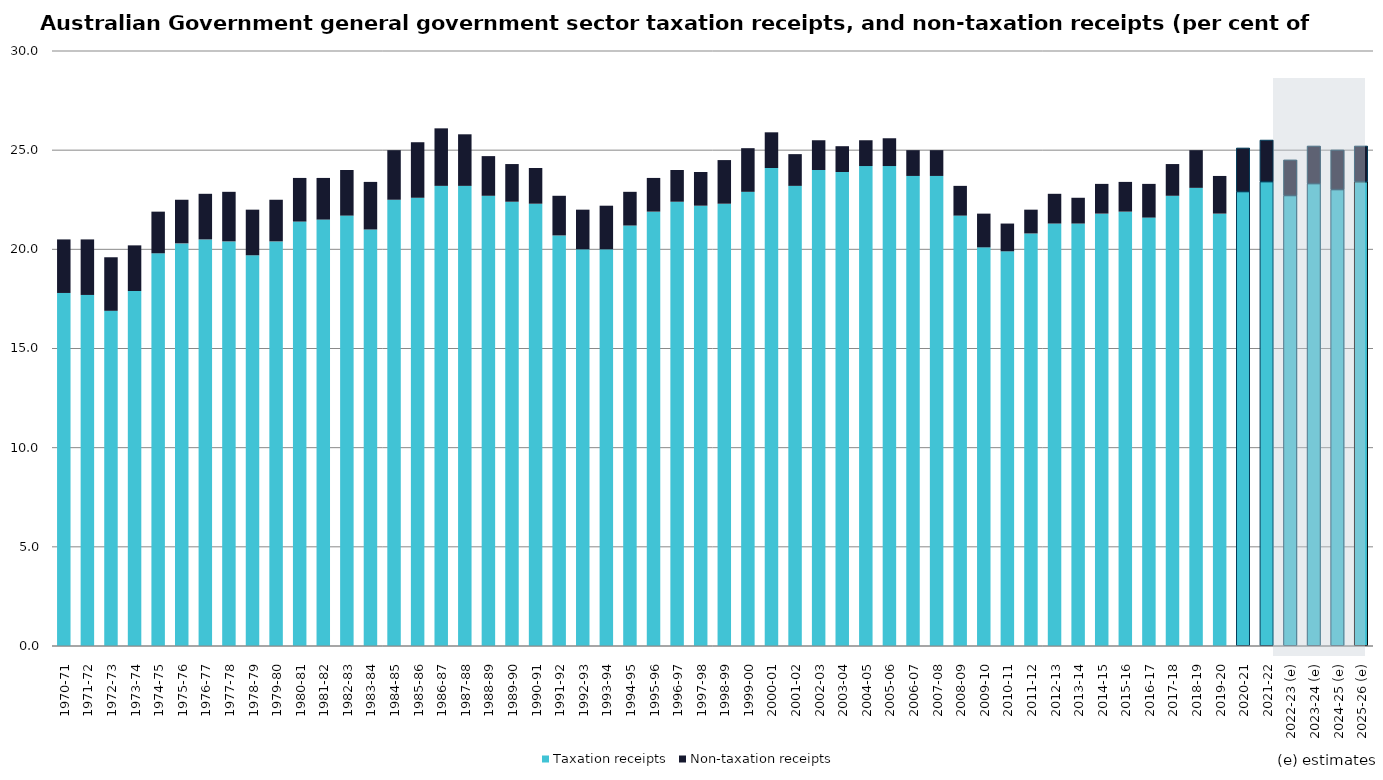
| Category | Taxation receipts | Non-taxation receipts |
|---|---|---|
| 1970-71 | 17.8 | 2.7 |
| 1971-72 | 17.7 | 2.8 |
| 1972-73 | 16.9 | 2.7 |
| 1973-74 | 17.9 | 2.3 |
| 1974-75 | 19.8 | 2.1 |
| 1975-76 | 20.3 | 2.2 |
| 1976-77 | 20.5 | 2.3 |
| 1977-78 | 20.4 | 2.5 |
| 1978-79 | 19.7 | 2.3 |
| 1979-80 | 20.4 | 2.1 |
| 1980-81 | 21.4 | 2.2 |
| 1981-82 | 21.5 | 2.1 |
| 1982-83 | 21.7 | 2.3 |
| 1983-84 | 21 | 2.4 |
| 1984-85 | 22.5 | 2.5 |
| 1985-86 | 22.6 | 2.8 |
| 1986-87 | 23.2 | 2.9 |
| 1987-88 | 23.2 | 2.6 |
| 1988-89 | 22.7 | 2 |
| 1989-90 | 22.4 | 1.9 |
| 1990-91 | 22.3 | 1.8 |
| 1991-92 | 20.7 | 2 |
| 1992-93 | 20 | 2 |
| 1993-94 | 20 | 2.2 |
| 1994-95 | 21.2 | 1.7 |
| 1995-96 | 21.9 | 1.7 |
| 1996-97 | 22.4 | 1.6 |
| 1997-98 | 22.2 | 1.7 |
| 1998-99 | 22.3 | 2.2 |
| 1999-00 | 22.9 | 2.2 |
| 2000-01 | 24.1 | 1.8 |
| 2001-02 | 23.2 | 1.6 |
| 2002-03 | 24 | 1.5 |
| 2003-04 | 23.9 | 1.3 |
| 2004-05 | 24.2 | 1.3 |
| 2005-06 | 24.2 | 1.4 |
| 2006-07 | 23.7 | 1.3 |
| 2007-08 | 23.7 | 1.3 |
| 2008-09 | 21.7 | 1.5 |
| 2009-10 | 20.1 | 1.7 |
| 2010-11 | 19.9 | 1.4 |
| 2011-12 | 20.8 | 1.2 |
| 2012-13 | 21.3 | 1.5 |
| 2013-14 | 21.3 | 1.3 |
| 2014-15 | 21.8 | 1.5 |
| 2015-16 | 21.9 | 1.5 |
| 2016-17 | 21.6 | 1.7 |
| 2017-18 | 22.7 | 1.6 |
| 2018-19 | 23.1 | 1.9 |
| 2019-20 | 21.8 | 1.9 |
| 2020-21 | 22.9 | 2.2 |
| 2021-22 | 23.4 | 2.1 |
| 2022-23 (e) | 22.7 | 1.8 |
| 2023-24 (e) | 23.3 | 1.9 |
| 2024-25 (e) | 23 | 2 |
| 2025-26 (e) | 23.4 | 1.8 |